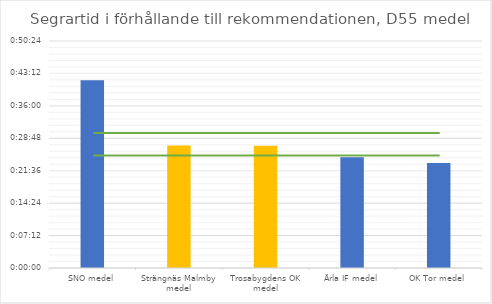
| Category | D55 tid |
|---|---|
| SNO medel | 0.029 |
| Strängnäs Malmby medel | 0.019 |
| Trosabygdens OK medel | 0.019 |
| Ärla IF medel | 0.017 |
| OK Tor medel | 0.016 |